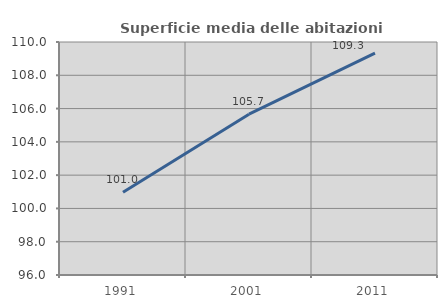
| Category | Superficie media delle abitazioni occupate |
|---|---|
| 1991.0 | 100.97 |
| 2001.0 | 105.664 |
| 2011.0 | 109.328 |